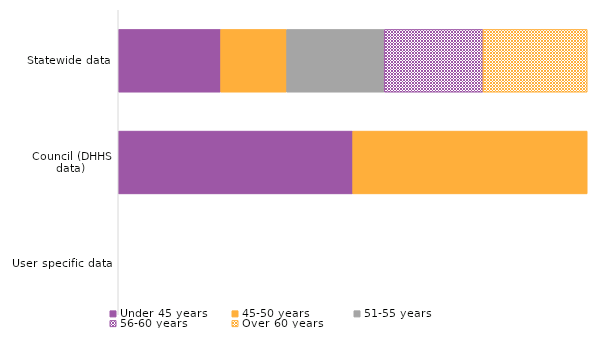
| Category | Under 45 years | 45-50 years | 51-55 years | 56-60 years | Over 60 years |
|---|---|---|---|---|---|
| Statewide data | 0.218 | 0.141 | 0.208 | 0.211 | 0.222 |
| Council (DHHS data) | 0.5 | 0.5 | 0 | 0 | 0 |
| User specific data | 0 | 0 | 0 | 0 | 0 |